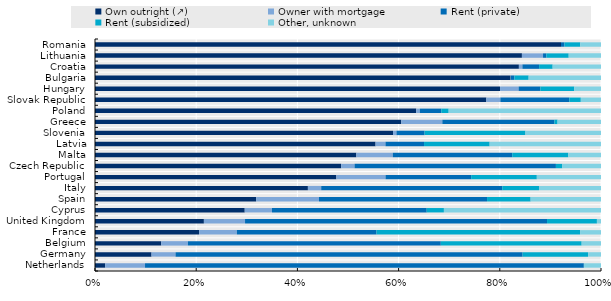
| Category | Own outright (↗) | Owner with mortgage | Rent (private) | Rent (subsidized) | Other, unknown |
|---|---|---|---|---|---|
| Netherlands | 0.02 | 0.079 | 0.867 | 0 | 0.034 |
| Germany | 0.112 | 0.047 | 0.686 | 0.129 | 0.026 |
| Belgium | 0.131 | 0.053 | 0.5 | 0.278 | 0.038 |
| France | 0.206 | 0.075 | 0.276 | 0.402 | 0.041 |
| United Kingdom | 0.215 | 0.081 | 0.597 | 0.099 | 0.008 |
| Cyprus | 0.296 | 0.054 | 0.306 | 0.034 | 0.31 |
| Spain | 0.318 | 0.124 | 0.332 | 0.086 | 0.139 |
| Italy | 0.421 | 0.026 | 0.358 | 0.073 | 0.123 |
| Portugal | 0.477 | 0.097 | 0.169 | 0.13 | 0.127 |
| Czech Republic | 0.486 | 0.026 | 0.398 | 0.013 | 0.076 |
| Malta | 0.517 | 0.072 | 0.236 | 0.111 | 0.065 |
| Latvia | 0.554 | 0.02 | 0.076 | 0.13 | 0.22 |
| Slovenia | 0.589 | 0.007 | 0.056 | 0.199 | 0.149 |
| Greece | 0.605 | 0.081 | 0.221 | 0.006 | 0.086 |
| Poland | 0.635 | 0.007 | 0.042 | 0.015 | 0.301 |
| Slovak Republic | 0.773 | 0.028 | 0.136 | 0.023 | 0.04 |
| Hungary | 0.8 | 0.037 | 0.043 | 0.067 | 0.053 |
| Bulgaria | 0.821 | 0 | 0.007 | 0.028 | 0.143 |
| Croatia | 0.838 | 0.007 | 0.033 | 0.027 | 0.096 |
| Lithuania | 0.844 | 0.042 | 0.007 | 0.044 | 0.064 |
| Romania | 0.921 | 0 | 0.007 | 0.031 | 0.041 |